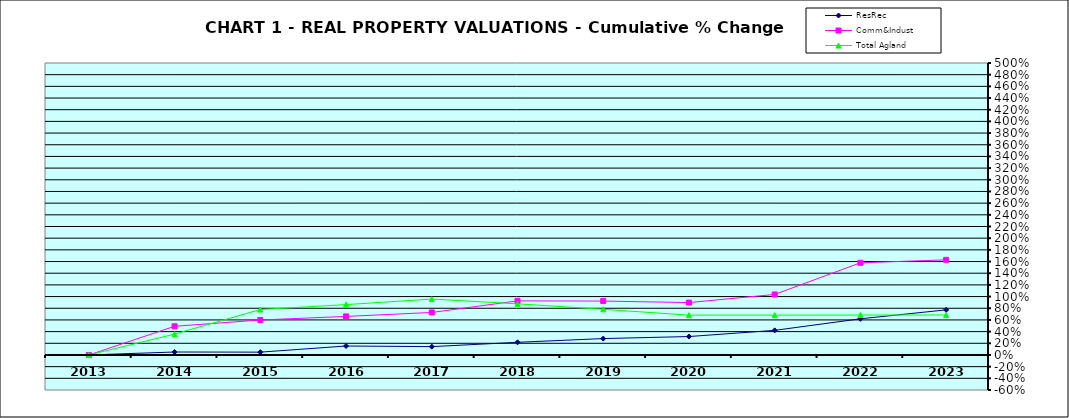
| Category | ResRec | Comm&Indust | Total Agland |
|---|---|---|---|
| 2013.0 | 0 | 0 | 0 |
| 2014.0 | 0.051 | 0.491 | 0.357 |
| 2015.0 | 0.048 | 0.599 | 0.778 |
| 2016.0 | 0.153 | 0.66 | 0.863 |
| 2017.0 | 0.143 | 0.728 | 0.957 |
| 2018.0 | 0.217 | 0.926 | 0.876 |
| 2019.0 | 0.281 | 0.923 | 0.782 |
| 2020.0 | 0.316 | 0.897 | 0.682 |
| 2021.0 | 0.422 | 1.036 | 0.682 |
| 2022.0 | 0.619 | 1.578 | 0.684 |
| 2023.0 | 0.772 | 1.629 | 0.684 |